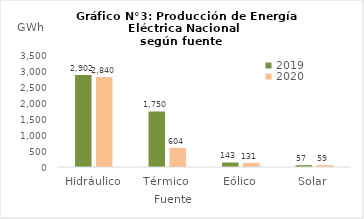
| Category | 2019 | 2020 |
|---|---|---|
| Hidráulico | 2901.902 | 2839.647 |
| Térmico | 1750.495 | 603.975 |
| Eólico | 142.651 | 130.606 |
| Solar | 57.423 | 58.928 |